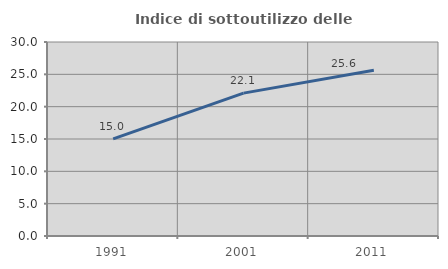
| Category | Indice di sottoutilizzo delle abitazioni  |
|---|---|
| 1991.0 | 15.014 |
| 2001.0 | 22.095 |
| 2011.0 | 25.628 |